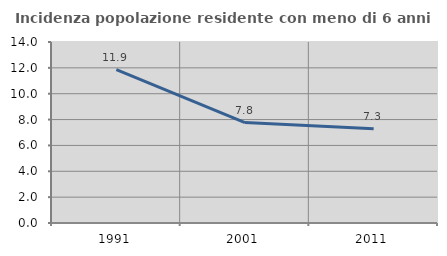
| Category | Incidenza popolazione residente con meno di 6 anni |
|---|---|
| 1991.0 | 11.87 |
| 2001.0 | 7.766 |
| 2011.0 | 7.294 |